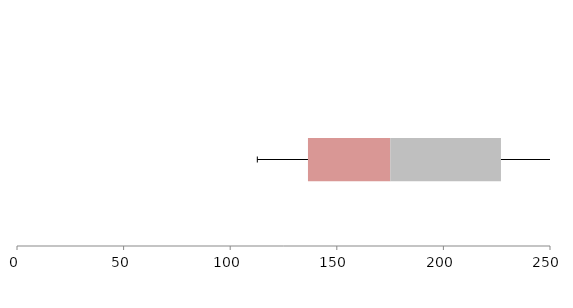
| Category | Series 1 | Series 2 | Series 3 |
|---|---|---|---|
| 0 | 136.475 | 38.604 | 51.919 |